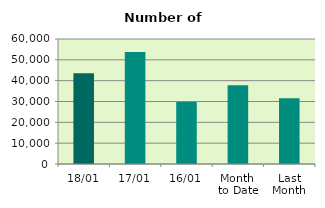
| Category | Series 0 |
|---|---|
| 18/01 | 43542 |
| 17/01 | 53804 |
| 16/01 | 29730 |
| Month 
to Date | 37746.462 |
| Last
Month | 31517.905 |